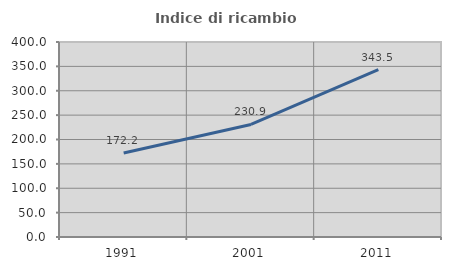
| Category | Indice di ricambio occupazionale  |
|---|---|
| 1991.0 | 172.165 |
| 2001.0 | 230.935 |
| 2011.0 | 343.478 |